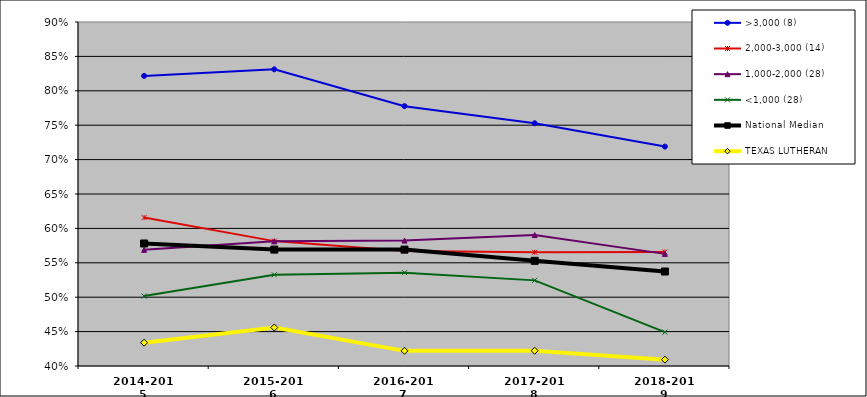
| Category | >3,000 (8) | 2,000-3,000 (14) | 1,000-2,000 (28) | <1,000 (28) | National Median | TEXAS LUTHERAN |
|---|---|---|---|---|---|---|
| 2014-2015 | 0.822 | 0.616 | 0.569 | 0.502 | 0.578 | 0.434 |
| 2015-2016 | 0.831 | 0.582 | 0.581 | 0.533 | 0.569 | 0.456 |
| 2016-2017 | 0.778 | 0.567 | 0.582 | 0.536 | 0.569 | 0.422 |
| 2017-2018 | 0.753 | 0.565 | 0.59 | 0.524 | 0.553 | 0.422 |
| 2018-2019 | 0.719 | 0.566 | 0.563 | 0.449 | 0.537 | 0.409 |